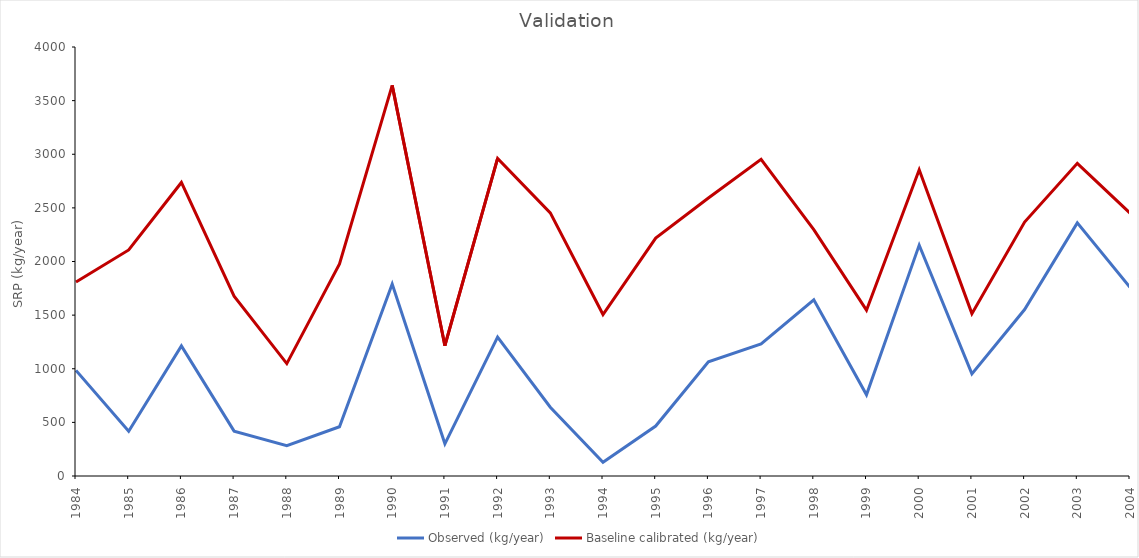
| Category | Observed (kg/year) | Baseline calibrated (kg/year) |
|---|---|---|
| 1984.0 | 984.254 | 1808 |
| 1985.0 | 418.033 | 2108 |
| 1986.0 | 1213.559 | 2737 |
| 1987.0 | 418.441 | 1677 |
| 1988.0 | 283.281 | 1048 |
| 1989.0 | 459.661 | 1978 |
| 1990.0 | 1789.836 | 3642 |
| 1991.0 | 300.126 | 1215 |
| 1992.0 | 1295.547 | 2961 |
| 1993.0 | 640.952 | 2453 |
| 1994.0 | 127.372 | 1506 |
| 1995.0 | 465.656 | 2218 |
| 1996.0 | 1064.672 | 2592 |
| 1997.0 | 1232.351 | 2952 |
| 1998.0 | 1643.196 | 2297 |
| 1999.0 | 756.774 | 1546 |
| 2000.0 | 2152.899 | 2856 |
| 2001.0 | 951.878 | 1514 |
| 2002.0 | 1551.919 | 2368 |
| 2003.0 | 2360.379 | 2915 |
| 2004.0 | 1759.654 | 2451 |